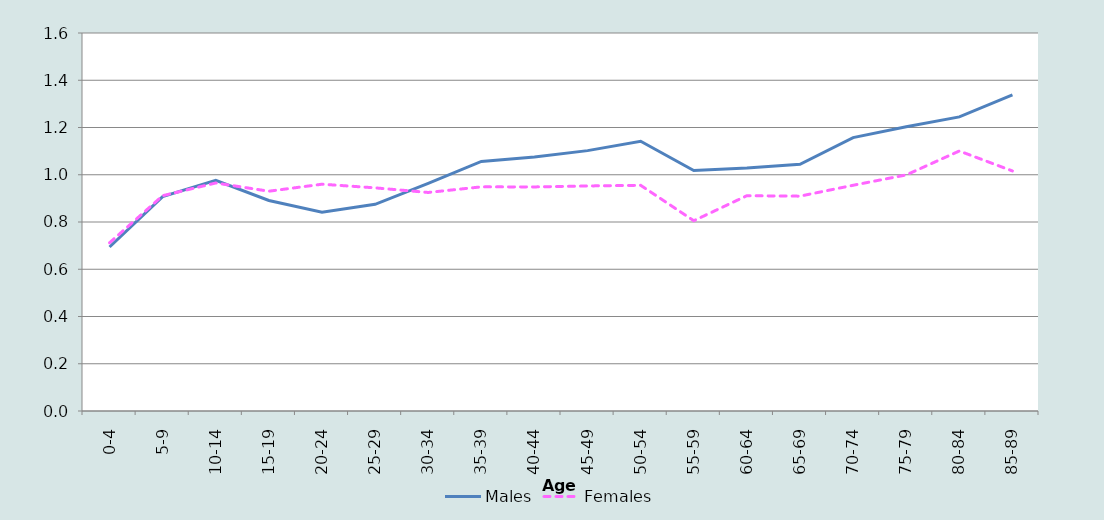
| Category | Males | Females |
|---|---|---|
| 0-4 | 0.694 | 0.712 |
| 5-9 | 0.907 | 0.911 |
| 10-14 | 0.976 | 0.965 |
| 15-19 | 0.891 | 0.93 |
| 20-24 | 0.841 | 0.96 |
| 25-29 | 0.875 | 0.945 |
| 30-34 | 0.963 | 0.925 |
| 35-39 | 1.056 | 0.949 |
| 40-44 | 1.075 | 0.948 |
| 45-49 | 1.102 | 0.953 |
| 50-54 | 1.142 | 0.955 |
| 55-59 | 1.018 | 0.805 |
| 60-64 | 1.028 | 0.911 |
| 65-69 | 1.044 | 0.909 |
| 70-74 | 1.157 | 0.955 |
| 75-79 | 1.203 | 0.999 |
| 80-84 | 1.245 | 1.101 |
| 85-89 | 1.338 | 1.016 |